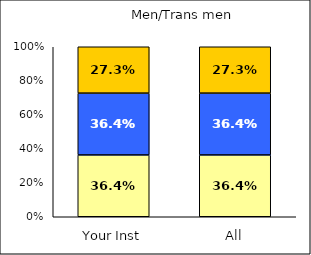
| Category | Low Science Identity | Average Science Identity | High Science Identity |
|---|---|---|---|
| Your Inst | 0.364 | 0.364 | 0.273 |
| All | 0.364 | 0.364 | 0.273 |